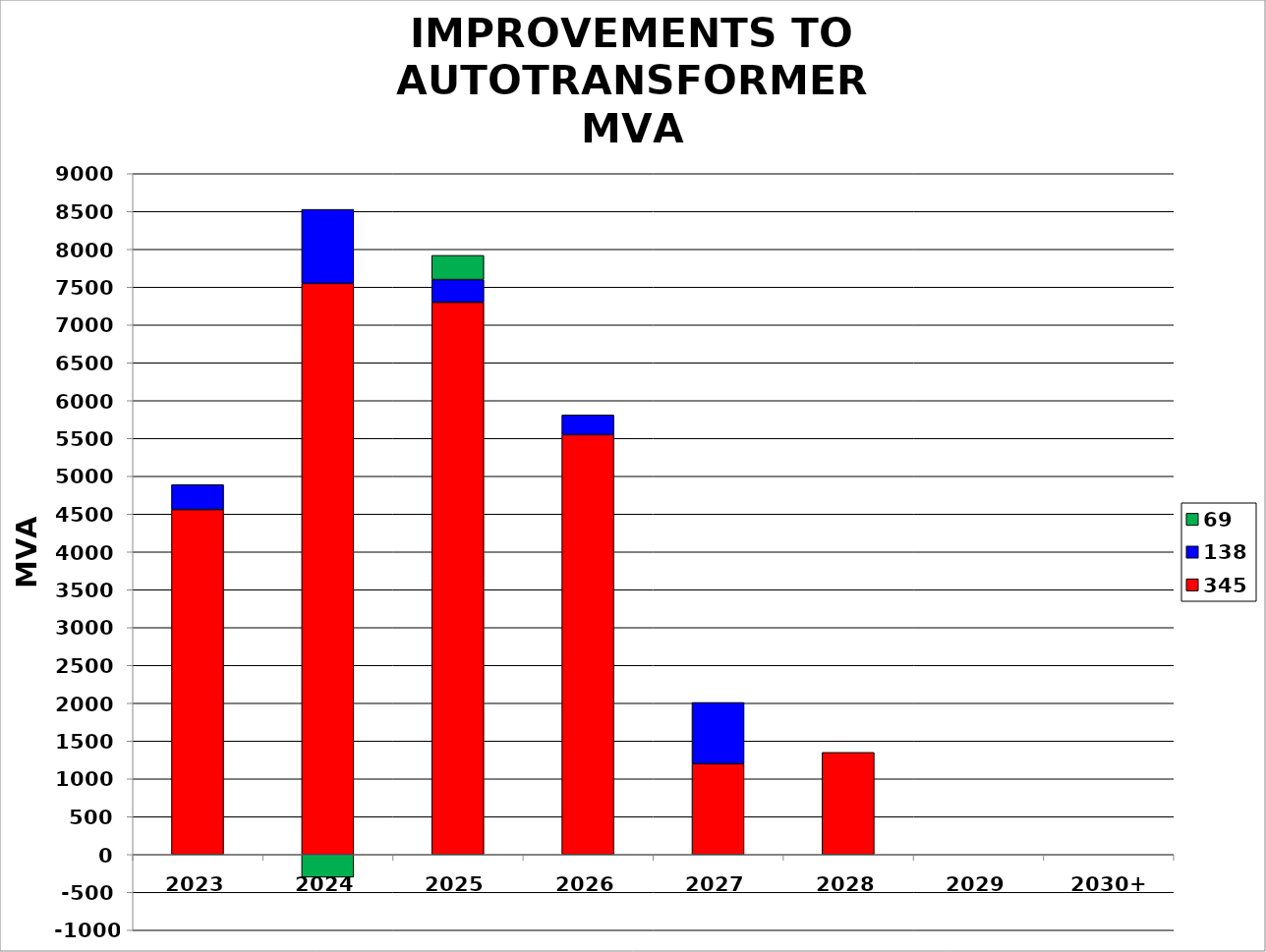
| Category | 345 | 138 | 69 |
|---|---|---|---|
| 2023 | 4560 | 330 | 0 |
| 2024 | 7550 | 977.8 | -300 |
| 2025 | 7300 | 300 | 320 |
| 2026 | 5550 | 260 | 0 |
| 2027 | 1200 | 810 | 0 |
| 2028 | 1350 | 0 | 0 |
| 2029 | 0 | 0 | 0 |
| 2030+ | 0 | 0 | 0 |